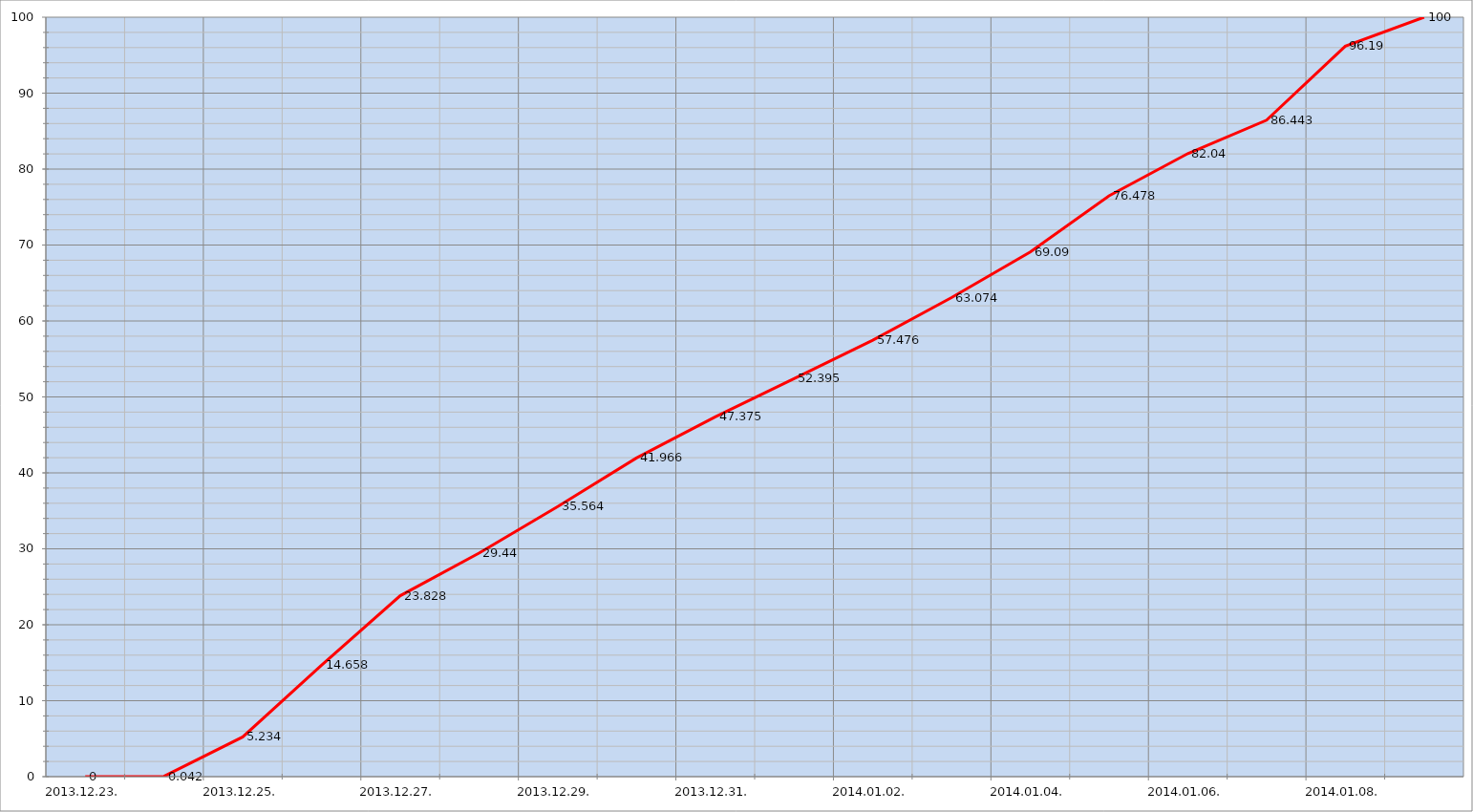
| Category | Szerver 1 |
|---|---|
| 2013-12-23 | 0 |
| 2013-12-24 | 0.042 |
| 2013-12-25 | 5.234 |
| 2013-12-26 | 14.658 |
| 2013-12-27 | 23.828 |
| 2013-12-28 | 29.44 |
| 2013-12-29 | 35.564 |
| 2013-12-30 | 41.966 |
| 2013-12-31 | 47.375 |
| 2014-01-01 | 52.395 |
| 2014-01-02 | 57.476 |
| 2014-01-03 | 63.074 |
| 2014-01-04 | 69.09 |
| 2014-01-05 | 76.478 |
| 2014-01-06 | 82.04 |
| 2014-01-07 | 86.443 |
| 2014-01-08 | 96.19 |
| 2014-01-09 | 100 |